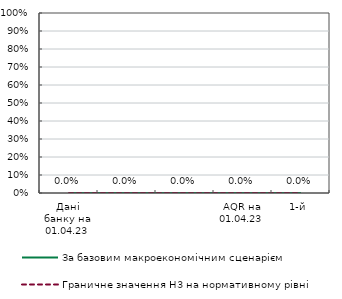
| Category | За базовим макроекономічним сценарієм | Граничне значення Н3 на нормативному рівні | Граничне значення Н3 за несприятливого сценарію |
|---|---|---|---|
| Дані банку на 01.04.23 | 0 | 0 |  |
| AQR на 01.04.23 | 0 | 0 |  |
| 1-й | 0 | 0 |  |
| 2-й | 0 | 0 |  |
| 3-й | 0 | 0 |  |